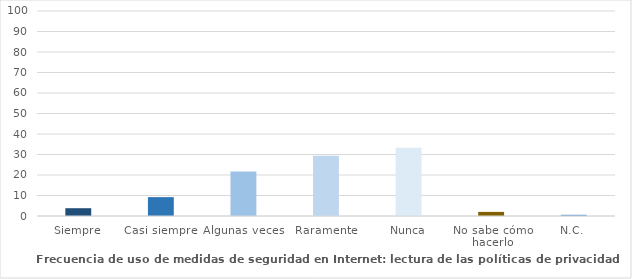
| Category | Series 0 |
|---|---|
| Siempre | 3.8 |
| Casi siempre | 9.2 |
| Algunas veces | 21.7 |
| Raramente | 29.4 |
| Nunca | 33.3 |
| No sabe cómo hacerlo | 2 |
| N.C. | 0.6 |